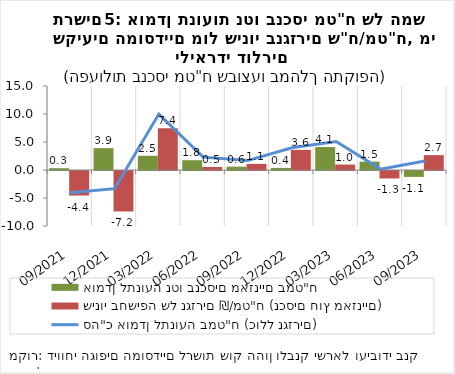
| Category | אומדן לתנועה נטו בנכסים מאזניים במט"ח | שינוי בחשיפה של נגזרים ₪/מט"ח (נכסים חוץ מאזניים) |
|---|---|---|
| 2021-09-30 | 0.322 | -4.383 |
| 2021-12-31 | 3.897 | -7.228 |
| 2022-03-31 | 2.537 | 7.444 |
| 2022-06-30 | 1.751 | 0.543 |
| 2022-09-30 | 0.595 | 1.089 |
| 2022-12-31 | 0.369 | 3.592 |
| 2023-03-31 | 4.097 | 0.976 |
| 2023-06-30 | 1.493 | -1.335 |
| 2023-09-30 | -1.052 | 2.656 |